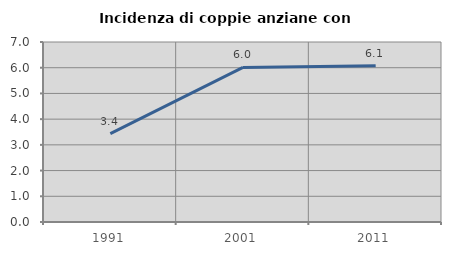
| Category | Incidenza di coppie anziane con figli |
|---|---|
| 1991.0 | 3.44 |
| 2001.0 | 6.012 |
| 2011.0 | 6.072 |